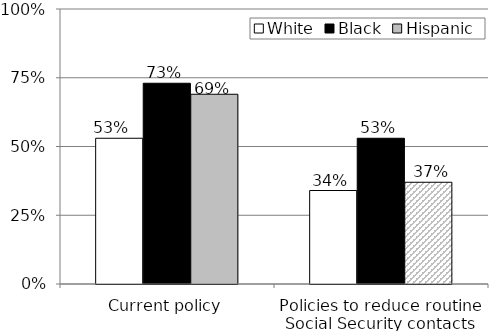
| Category | White | Black | Hispanic |
|---|---|---|---|
| Current policy | 0.53 | 0.73 | 0.69 |
| Policies to reduce routine Social Security contacts | 0.34 | 0.53 | 0.37 |